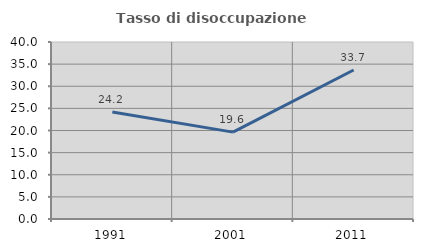
| Category | Tasso di disoccupazione giovanile  |
|---|---|
| 1991.0 | 24.204 |
| 2001.0 | 19.632 |
| 2011.0 | 33.663 |